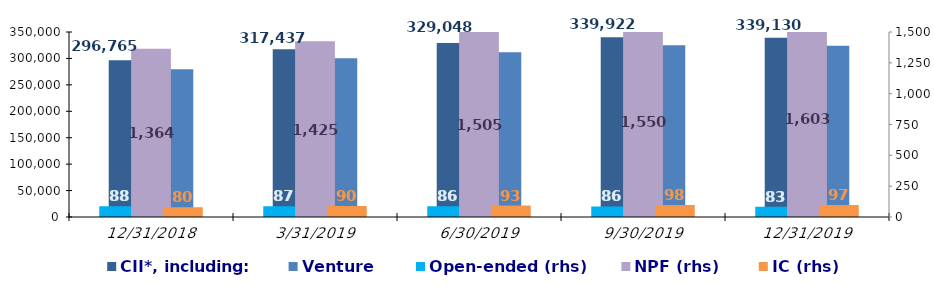
| Category | CII*, including: | Venture |
|---|---|---|
| 12/31/18 | 296765.4 | 279713.3 |
| 3/31/19 | 317437.485 | 300241.731 |
| 6/30/19 | 329047.5 | 311811.9 |
| 9/30/19 | 339921.7 | 325109.9 |
| 12/31/19 | 339129.8 | 324105.005 |